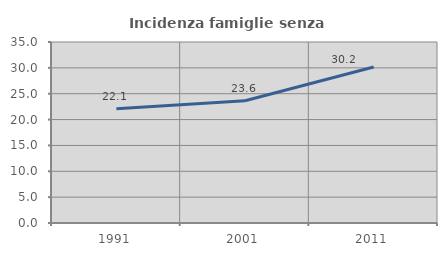
| Category | Incidenza famiglie senza nuclei |
|---|---|
| 1991.0 | 22.069 |
| 2001.0 | 23.643 |
| 2011.0 | 30.176 |